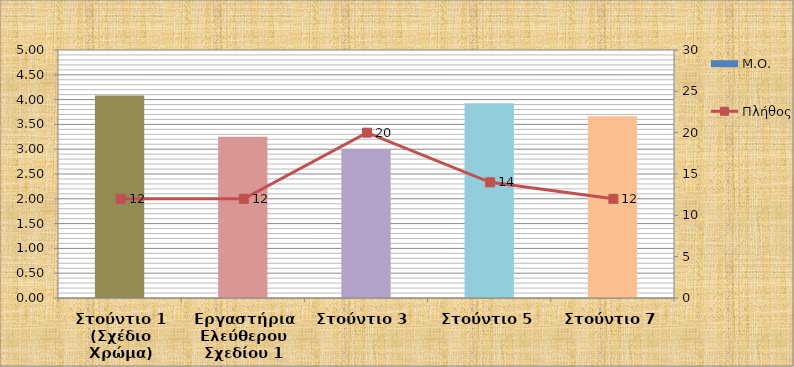
| Category | Μ.Ο. |
|---|---|
| Στούντιο 1 (Σχέδιο Χρώμα) | 4.083 |
| Εργαστήρια Ελεύθερου Σχεδίου 1 | 3.25 |
| Στούντιο 3  | 3 |
| Στούντιο 5 | 3.929 |
| Στούντιο 7 | 3.667 |